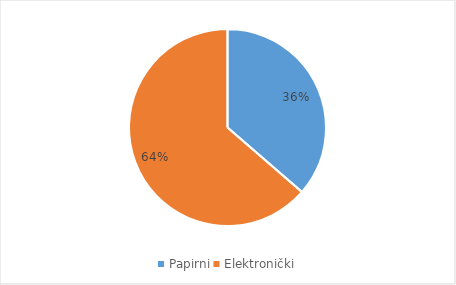
| Category | Series 0 |
|---|---|
| Papirni | 50324447057 |
| Elektronički | 88090688245 |